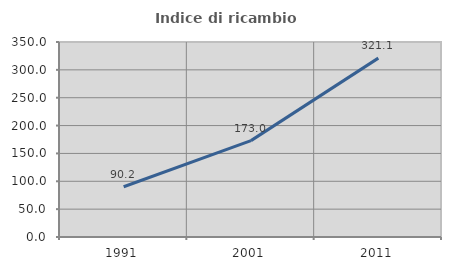
| Category | Indice di ricambio occupazionale  |
|---|---|
| 1991.0 | 90.164 |
| 2001.0 | 172.973 |
| 2011.0 | 321.053 |